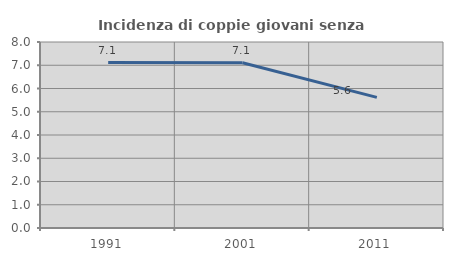
| Category | Incidenza di coppie giovani senza figli |
|---|---|
| 1991.0 | 7.115 |
| 2001.0 | 7.108 |
| 2011.0 | 5.618 |